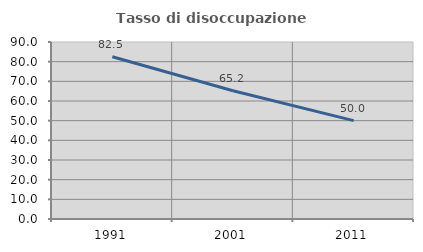
| Category | Tasso di disoccupazione giovanile  |
|---|---|
| 1991.0 | 82.5 |
| 2001.0 | 65.217 |
| 2011.0 | 50 |